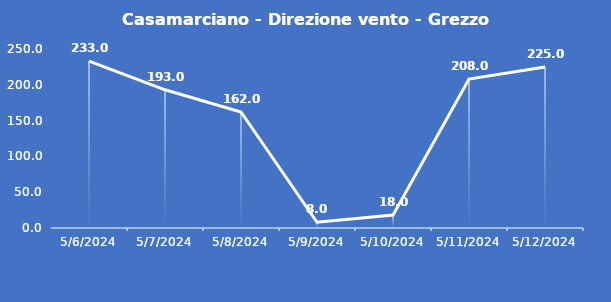
| Category | Casamarciano - Direzione vento - Grezzo (°N) |
|---|---|
| 5/6/24 | 233 |
| 5/7/24 | 193 |
| 5/8/24 | 162 |
| 5/9/24 | 8 |
| 5/10/24 | 18 |
| 5/11/24 | 208 |
| 5/12/24 | 225 |